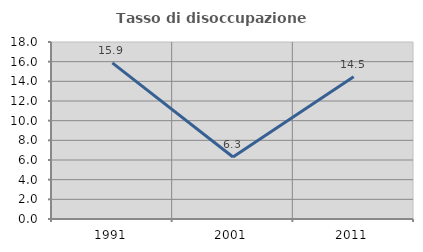
| Category | Tasso di disoccupazione giovanile  |
|---|---|
| 1991.0 | 15.877 |
| 2001.0 | 6.311 |
| 2011.0 | 14.465 |